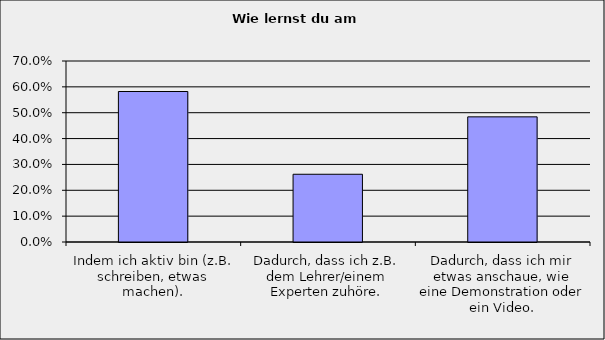
| Category | Series 0 |
|---|---|
| Indem ich aktiv bin (z.B. schreiben, etwas machen). | 0.582 |
| Dadurch, dass ich z.B. dem Lehrer/einem Experten zuhöre. | 0.262 |
| Dadurch, dass ich mir etwas anschaue, wie eine Demonstration oder ein Video. | 0.484 |